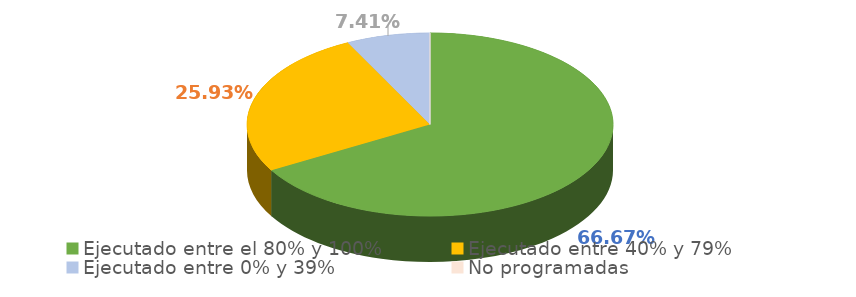
| Category | Series 0 |
|---|---|
| Ejecutado entre el 80% y 100% | 0.667 |
| Ejecutado entre 40% y 79% | 0.259 |
| Ejecutado entre 0% y 39% | 0.074 |
| No programadas | 0 |